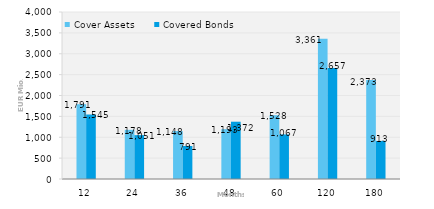
| Category | Cover Assets | Covered Bonds |
|---|---|---|
| 12.0 | 1791.286 | 1544.565 |
| 24.0 | 1177.851 | 1050.578 |
| 36.0 | 1147.96 | 790.5 |
| 48.0 | 1193.14 | 1372.113 |
| 60.0 | 1527.771 | 1067.442 |
| 120.0 | 3360.803 | 2656.785 |
| 180.0 | 2372.956 | 912.702 |